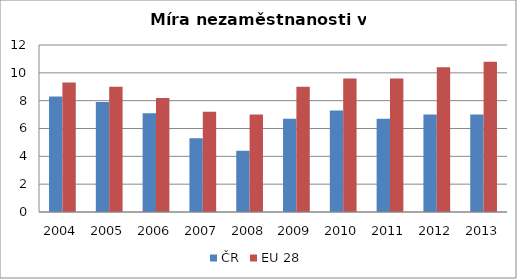
| Category | ČR | EU 28 |
|---|---|---|
| 2004 | 8.3 | 9.3 |
| 2005 | 7.9 | 9 |
| 2006 | 7.1 | 8.2 |
| 2007 | 5.3 | 7.2 |
| 2008 | 4.4 | 7 |
| 2009 | 6.7 | 9 |
| 2010 | 7.3 | 9.6 |
| 2011 | 6.7 | 9.6 |
| 2012 | 7 | 10.4 |
| 2013 | 7 | 10.8 |